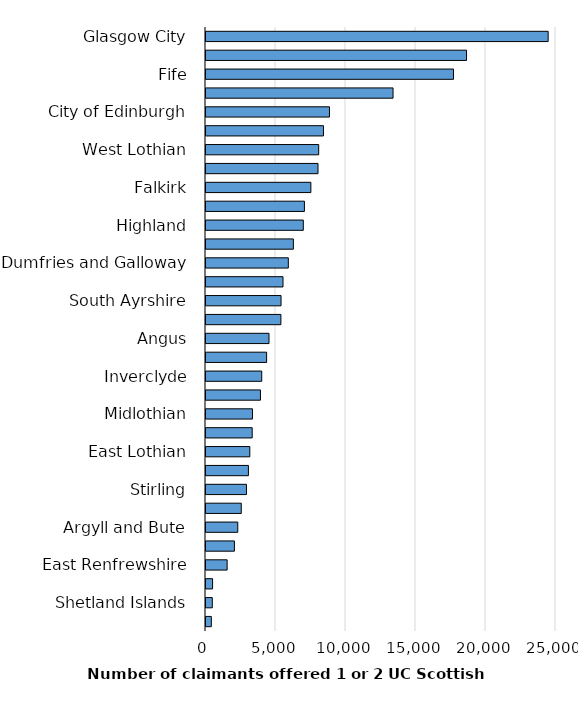
| Category | Series 0 |
|---|---|
| Glasgow City | 24440 |
| North Lanarkshire | 18610 |
| Fife | 17680 |
| South Lanarkshire | 13360 |
| City of Edinburgh | 8820 |
| Dundee City | 8390 |
| West Lothian | 8050 |
| North Ayrshire | 8000 |
| Falkirk | 7490 |
| East Ayrshire | 7030 |
| Highland | 6950 |
| Renfrewshire | 6240 |
| Dumfries and Galloway | 5880 |
| Aberdeen City | 5500 |
| South Ayrshire | 5360 |
| Aberdeenshire | 5350 |
| Angus | 4500 |
| Perth and Kinross | 4330 |
| Inverclyde | 3980 |
| Scottish Borders | 3890 |
| Midlothian | 3320 |
| West Dunbartonshire | 3300 |
| East Lothian | 3130 |
| Moray | 3030 |
| Stirling | 2890 |
| Clackmannanshire | 2520 |
| Argyll and Bute | 2270 |
| East Dunbartonshire | 2030 |
| East Renfrewshire | 1510 |
| Na h-Eileanan Siar | 470 |
| Shetland Islands | 450 |
| Orkney Islands | 380 |